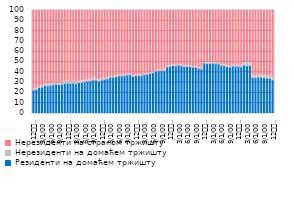
| Category | Резиденти на домаћем тржишту | Нерезиденти на домаћем тржишту | Нерезиденти на страном тржишту |
|---|---|---|---|
| 12
2013. | 22.746 | 0.884 | 76.37 |
| 1 | 23.113 | 1.21 | 75.676 |
| 2 | 25.082 | 1.193 | 73.725 |
| 3 | 25.523 | 1.082 | 73.395 |
| 4 | 27.022 | 1.419 | 71.559 |
| 5 | 26.732 | 1.389 | 71.879 |
| 6 | 27.449 | 1.371 | 71.18 |
| 7 | 27.865 | 1.314 | 70.821 |
| 8 | 28.399 | 1.263 | 70.338 |
| 9 | 28.112 | 1.261 | 70.627 |
| 10 | 28.396 | 1.308 | 70.296 |
| 11 | 29.056 | 2.275 | 68.669 |
| 12
2014. | 29.222 | 2.157 | 68.621 |
| 1 | 28.996 | 1.846 | 69.158 |
| 2 | 29.375 | 2.156 | 68.469 |
| 3 | 28.86 | 2.123 | 69.017 |
| 4 | 30.112 | 1.915 | 67.972 |
| 5 | 30.094 | 1.642 | 68.263 |
| 6 | 30.54 | 1.666 | 67.794 |
| 7 | 31.186 | 1.524 | 67.29 |
| 8 | 31.557 | 1.585 | 66.858 |
| 9 | 32.403 | 1.199 | 66.398 |
| 10 | 32.369 | 1.176 | 66.455 |
| 11 | 31.432 | 1.144 | 67.424 |
| 12
2015. | 32.295 | 1.065 | 66.64 |
| 1 | 33.081 | 1.013 | 65.907 |
| 2 | 33.56 | 0.847 | 65.593 |
| 3 | 35.045 | 0.74 | 64.216 |
| 4 | 35.12 | 0.702 | 64.177 |
| 5 | 35.666 | 0.849 | 63.484 |
| 6 | 36.486 | 0.776 | 62.739 |
| 7 | 36.47 | 0.751 | 62.779 |
| 8 | 36.672 | 0.676 | 62.652 |
| 9 | 37.327 | 0.673 | 62 |
| 10 | 37.415 | 0.656 | 61.929 |
| 11 | 35.998 | 0.759 | 63.243 |
| 12
2016. | 36.713 | 0.701 | 62.586 |
| 1 | 36.757 | 0.676 | 62.567 |
| 2 | 36.741 | 0.675 | 62.584 |
| 3 | 37.619 | 0.726 | 61.655 |
| 4 | 37.923 | 0.745 | 61.332 |
| 5 | 38.982 | 0.741 | 60.277 |
| 6 | 39.517 | 0.655 | 59.828 |
| 7 | 41.023 | 0.695 | 58.282 |
| 8 | 41.301 | 0.699 | 58 |
| 9 | 41.537 | 0.776 | 57.687 |
| 10 | 41.277 | 0.747 | 57.976 |
| 11 | 45.37 | 0.839 | 53.792 |
| 12
2017. | 45.716 | 0.72 | 53.564 |
| 1 | 46.55 | 0.973 | 52.477 |
| 2 | 46.09 | 0.947 | 52.964 |
| 3 | 46.816 | 0.875 | 52.308 |
| 4 | 46.346 | 0.82 | 52.834 |
| 5 | 45.455 | 0.786 | 53.759 |
| 6 | 45.49 | 0.789 | 53.721 |
| 7 | 45.446 | 0.714 | 53.841 |
| 8 | 44.864 | 0.694 | 54.443 |
| 9 | 44.608 | 0.681 | 54.711 |
| 10 | 43.66 | 0.664 | 55.676 |
| 11 | 43.209 | 0.625 | 56.166 |
| 12
2018. | 49.022 | 0.553 | 50.425 |
| 1 | 48.569 | 0.551 | 50.879 |
| 2 | 48.613 | 0.653 | 50.735 |
| 3 | 48.634 | 0.688 | 50.678 |
| 4 | 48.22 | 0.694 | 51.086 |
| 5 | 48.072 | 0.822 | 51.106 |
| 6 | 46.599 | 0.971 | 52.429 |
| 7 | 46.234 | 0.958 | 52.808 |
| 8 | 45.641 | 0.929 | 53.43 |
| 9 | 44.859 | 0.936 | 54.205 |
| 10 | 45.829 | 1.104 | 53.067 |
| 11 | 45.494 | 1.096 | 53.409 |
| 12
2019. | 45.723 | 1.083 | 53.194 |
| 1 | 45.119 | 1.918 | 52.963 |
| 2 | 46.867 | 2.973 | 50.16 |
| 3 | 46.256 | 2.918 | 50.827 |
| 4 | 46.459 | 2.887 | 50.653 |
| 5 | 34.989 | 2.119 | 62.892 |
| 6 | 34.742 | 2.07 | 63.188 |
| 7 | 35.109 | 2.074 | 62.816 |
| 8 | 35.162 | 1.948 | 62.89 |
| 9 | 34.685 | 1.931 | 63.384 |
| 10 | 34.23 | 1.946 | 63.824 |
| 11 | 34.153 | 1.978 | 63.87 |
| 12
2020. | 32.65 | 1.904 | 65.446 |